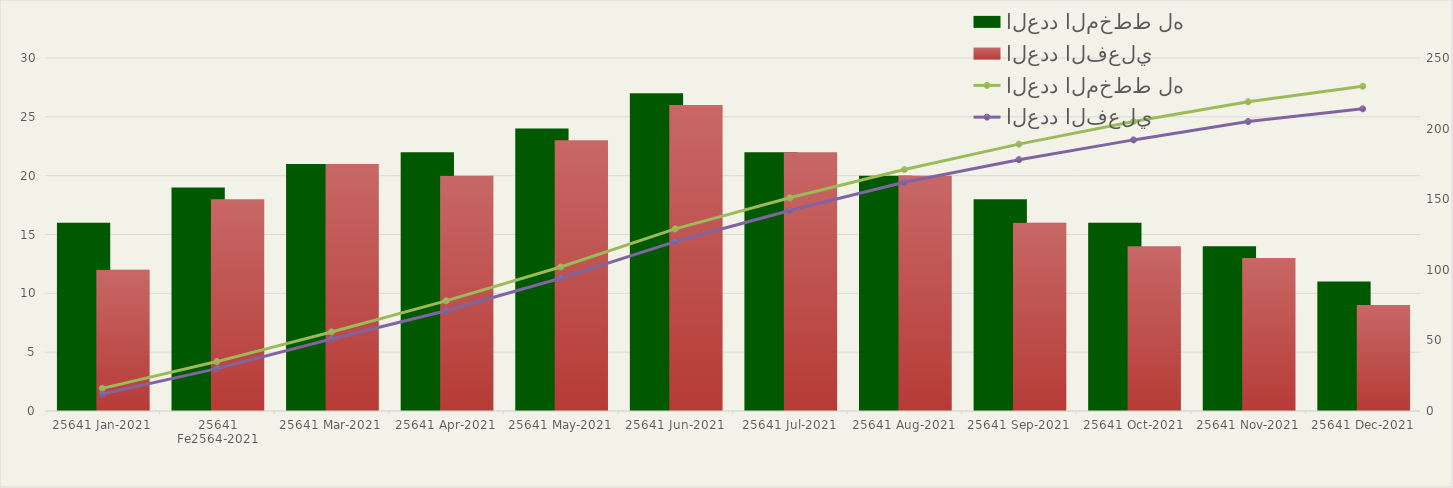
| Category | العدد المخطط له | العدد الفعلي |
|---|---|---|
| 2021-01-01 | 16 | 12 |
| 2021-02-01 | 19 | 18 |
| 2021-03-01 | 21 | 21 |
| 2021-04-01 | 22 | 20 |
| 2021-05-01 | 24 | 23 |
| 2021-06-01 | 27 | 26 |
| 2021-07-01 | 22 | 22 |
| 2021-08-01 | 20 | 20 |
| 2021-09-01 | 18 | 16 |
| 2021-10-01 | 16 | 14 |
| 2021-11-01 | 14 | 13 |
| 2021-12-01 | 11 | 9 |